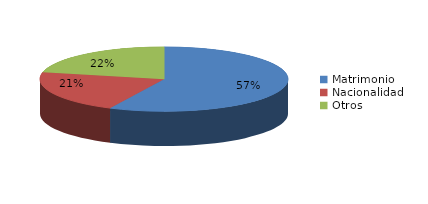
| Category | Series 0 |
|---|---|
| Matrimonio | 2345 |
| Nacionalidad | 875 |
| Otros | 885 |